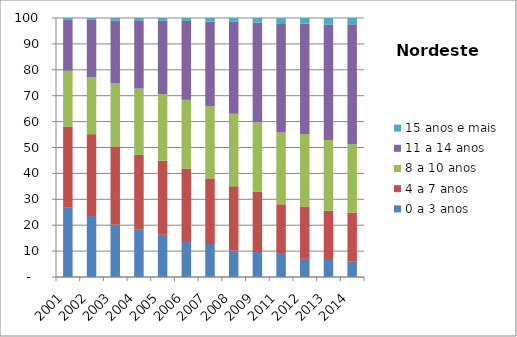
| Category | 0 a 3 anos | 4 a 7 anos | 8 a 10 anos | 11 a 14 anos | 15 anos e mais |
|---|---|---|---|---|---|
| 2001.0 | 26.72 | 31.25 | 21.65 | 19.59 | 0.79 |
| 2002.0 | 23.54 | 31.61 | 22 | 22.13 | 0.73 |
| 2003.0 | 20.19 | 30.23 | 24.46 | 24.18 | 0.95 |
| 2004.0 | 18.47 | 28.68 | 25.59 | 26.38 | 0.88 |
| 2005.0 | 16.3 | 28.58 | 25.77 | 28.34 | 1 |
| 2006.0 | 13.9 | 27.83 | 26.67 | 30.49 | 1.11 |
| 2007.0 | 12.74 | 25.33 | 27.93 | 32.59 | 1.41 |
| 2008.0 | 10.18 | 24.86 | 27.99 | 35.51 | 1.46 |
| 2009.0 | 9.65 | 23.24 | 26.72 | 38.68 | 1.72 |
| 2011.0 | 9.25 | 18.82 | 27.75 | 41.82 | 2.35 |
| 2012.0 | 7.02 | 20.24 | 27.98 | 42.57 | 2.2 |
| 2013.0 | 6.56 | 18.99 | 27.38 | 44.45 | 2.62 |
| 2014.0 | 6.1 | 18.79 | 26.38 | 46.31 | 2.43 |